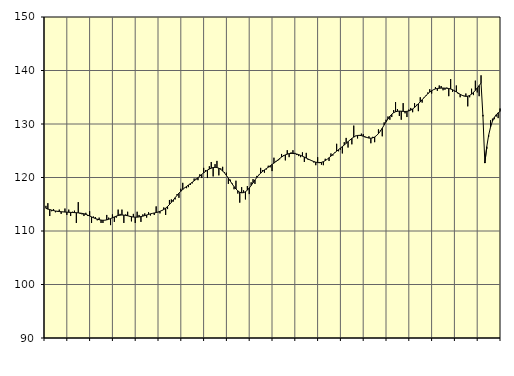
| Category | Piggar | Samtliga anställda (inkl. anställda utomlands) |
|---|---|---|
| nan | 114.7 | 114.23 |
| 1.0 | 115.2 | 114.09 |
| 1.0 | 112.8 | 114.01 |
| 1.0 | 113.7 | 113.9 |
| 1.0 | 114.1 | 113.82 |
| 1.0 | 113.5 | 113.73 |
| 1.0 | 113.6 | 113.69 |
| 1.0 | 114 | 113.64 |
| 1.0 | 113.2 | 113.6 |
| 1.0 | 113.6 | 113.57 |
| 1.0 | 114.2 | 113.54 |
| 1.0 | 113 | 113.52 |
| nan | 114 | 113.5 |
| 2.0 | 112.8 | 113.48 |
| 2.0 | 113.6 | 113.46 |
| 2.0 | 113.8 | 113.44 |
| 2.0 | 111.5 | 113.42 |
| 2.0 | 115.4 | 113.39 |
| 2.0 | 113.2 | 113.35 |
| 2.0 | 113.1 | 113.3 |
| 2.0 | 112.8 | 113.22 |
| 2.0 | 113.4 | 113.11 |
| 2.0 | 112.8 | 112.97 |
| 2.0 | 113.7 | 112.81 |
| nan | 111.5 | 112.64 |
| 3.0 | 112.7 | 112.48 |
| 3.0 | 112.6 | 112.33 |
| 3.0 | 112 | 112.21 |
| 3.0 | 112.5 | 112.11 |
| 3.0 | 111.5 | 112.04 |
| 3.0 | 111.5 | 112 |
| 3.0 | 112 | 112.02 |
| 3.0 | 113 | 112.08 |
| 3.0 | 112.5 | 112.19 |
| 3.0 | 111.1 | 112.32 |
| 3.0 | 113.1 | 112.48 |
| nan | 111.7 | 112.63 |
| 4.0 | 112.5 | 112.78 |
| 4.0 | 114 | 112.89 |
| 4.0 | 113.2 | 112.96 |
| 4.0 | 114 | 112.99 |
| 4.0 | 111.5 | 112.97 |
| 4.0 | 113.1 | 112.92 |
| 4.0 | 113.6 | 112.85 |
| 4.0 | 112.7 | 112.76 |
| 4.0 | 111.8 | 112.67 |
| 4.0 | 113.2 | 112.61 |
| 4.0 | 111.5 | 112.58 |
| nan | 113.6 | 112.59 |
| 5.0 | 113 | 112.63 |
| 5.0 | 111.7 | 112.7 |
| 5.0 | 113.1 | 112.78 |
| 5.0 | 113.3 | 112.88 |
| 5.0 | 112.5 | 112.99 |
| 5.0 | 113.5 | 113.11 |
| 5.0 | 112.9 | 113.2 |
| 5.0 | 113.3 | 113.29 |
| 5.0 | 113 | 113.37 |
| 5.0 | 114.6 | 113.45 |
| 5.0 | 113.5 | 113.55 |
| nan | 113.3 | 113.68 |
| 6.0 | 113.9 | 113.83 |
| 6.0 | 114.4 | 114.02 |
| 6.0 | 113 | 114.27 |
| 6.0 | 114.1 | 114.58 |
| 6.0 | 115.8 | 114.94 |
| 6.0 | 115.9 | 115.35 |
| 6.0 | 115.5 | 115.79 |
| 6.0 | 115.9 | 116.23 |
| 6.0 | 116.9 | 116.66 |
| 6.0 | 116.2 | 117.07 |
| 6.0 | 117.9 | 117.43 |
| nan | 119 | 117.76 |
| 7.0 | 118.1 | 118.05 |
| 7.0 | 118 | 118.33 |
| 7.0 | 118.2 | 118.59 |
| 7.0 | 118.6 | 118.85 |
| 7.0 | 118.9 | 119.11 |
| 7.0 | 119.8 | 119.38 |
| 7.0 | 119.8 | 119.66 |
| 7.0 | 119.5 | 119.96 |
| 7.0 | 120.6 | 120.26 |
| 7.0 | 119.9 | 120.57 |
| 7.0 | 121.8 | 120.87 |
| nan | 121.4 | 121.13 |
| 8.0 | 119.9 | 121.37 |
| 8.0 | 122.1 | 121.58 |
| 8.0 | 122.9 | 121.74 |
| 8.0 | 120.2 | 121.86 |
| 8.0 | 122.5 | 121.9 |
| 8.0 | 123.1 | 121.86 |
| 8.0 | 120.4 | 121.73 |
| 8.0 | 121.7 | 121.52 |
| 8.0 | 122 | 121.22 |
| 8.0 | 121 | 120.84 |
| 8.0 | 120.9 | 120.38 |
| nan | 118.8 | 119.88 |
| 9.0 | 119.6 | 119.34 |
| 9.0 | 118.9 | 118.8 |
| 9.0 | 117.8 | 118.29 |
| 9.0 | 119.4 | 117.85 |
| 9.0 | 117 | 117.5 |
| 9.0 | 115.3 | 117.25 |
| 9.0 | 118.2 | 117.14 |
| 9.0 | 117.6 | 117.17 |
| 9.0 | 115.9 | 117.34 |
| 9.0 | 118.4 | 117.63 |
| 9.0 | 116.9 | 118.03 |
| nan | 119.1 | 118.51 |
| 10.0 | 119.7 | 119.02 |
| 10.0 | 118.8 | 119.54 |
| 10.0 | 120.3 | 120.01 |
| 10.0 | 120.5 | 120.44 |
| 10.0 | 121.8 | 120.81 |
| 10.0 | 121.4 | 121.13 |
| 10.0 | 120.9 | 121.42 |
| 10.0 | 121.5 | 121.67 |
| 10.0 | 122.2 | 121.92 |
| 10.0 | 121.9 | 122.18 |
| 10.0 | 121.2 | 122.44 |
| nan | 123.7 | 122.69 |
| 11.0 | 123.1 | 122.97 |
| 11.0 | 123.1 | 123.26 |
| 11.0 | 123.4 | 123.55 |
| 11.0 | 124.4 | 123.82 |
| 11.0 | 124.2 | 124.05 |
| 11.0 | 123.2 | 124.23 |
| 11.0 | 125.1 | 124.37 |
| 11.0 | 123.8 | 124.46 |
| 11.0 | 124.7 | 124.5 |
| 11.0 | 125.1 | 124.49 |
| 11.0 | 124.6 | 124.46 |
| nan | 124.2 | 124.39 |
| 12.0 | 124 | 124.28 |
| 12.0 | 123.8 | 124.14 |
| 12.0 | 124.7 | 123.98 |
| 12.0 | 122.9 | 123.81 |
| 12.0 | 124.6 | 123.63 |
| 12.0 | 123.3 | 123.45 |
| 12.0 | 123.3 | 123.28 |
| 12.0 | 123.1 | 123.12 |
| 12.0 | 122.8 | 122.98 |
| 12.0 | 122.3 | 122.87 |
| 12.0 | 123.8 | 122.79 |
| nan | 122.9 | 122.77 |
| 13.0 | 122.4 | 122.83 |
| 13.0 | 122.3 | 122.96 |
| 13.0 | 123.5 | 123.16 |
| 13.0 | 123.4 | 123.4 |
| 13.0 | 123.1 | 123.69 |
| 13.0 | 124.5 | 124 |
| 13.0 | 124.1 | 124.31 |
| 13.0 | 124.7 | 124.62 |
| 13.0 | 126.3 | 124.91 |
| 13.0 | 124.9 | 125.21 |
| 13.0 | 125.2 | 125.49 |
| nan | 124.5 | 125.78 |
| 14.0 | 126.6 | 126.07 |
| 14.0 | 127.4 | 126.38 |
| 14.0 | 125.6 | 126.7 |
| 14.0 | 127 | 127.01 |
| 14.0 | 126.2 | 127.3 |
| 14.0 | 129.7 | 127.55 |
| 14.0 | 127.8 | 127.75 |
| 14.0 | 127.3 | 127.86 |
| 14.0 | 127.8 | 127.88 |
| 14.0 | 128.2 | 127.83 |
| 14.0 | 128.1 | 127.72 |
| nan | 127.5 | 127.6 |
| 15.0 | 127.5 | 127.47 |
| 15.0 | 127.7 | 127.37 |
| 15.0 | 126.4 | 127.34 |
| 15.0 | 127.6 | 127.41 |
| 15.0 | 126.6 | 127.57 |
| 15.0 | 127.9 | 127.84 |
| 15.0 | 129 | 128.2 |
| 15.0 | 128.8 | 128.67 |
| 15.0 | 127.7 | 129.22 |
| 15.0 | 130.3 | 129.81 |
| 15.0 | 130.8 | 130.4 |
| nan | 131.4 | 130.95 |
| 16.0 | 130.8 | 131.44 |
| 16.0 | 131.3 | 131.82 |
| 16.0 | 132.6 | 132.11 |
| 16.0 | 134.1 | 132.29 |
| 16.0 | 132.8 | 132.38 |
| 16.0 | 131.5 | 132.41 |
| 16.0 | 130.8 | 132.39 |
| 16.0 | 133.9 | 132.36 |
| 16.0 | 132 | 132.34 |
| 16.0 | 131.3 | 132.37 |
| 16.0 | 132.7 | 132.45 |
| nan | 133 | 132.59 |
| 17.0 | 132.2 | 132.81 |
| 17.0 | 133.9 | 133.09 |
| 17.0 | 133.6 | 133.42 |
| 17.0 | 132.4 | 133.77 |
| 17.0 | 135 | 134.14 |
| 17.0 | 134 | 134.53 |
| 17.0 | 135 | 134.92 |
| 17.0 | 135.4 | 135.3 |
| 17.0 | 135.9 | 135.65 |
| 17.0 | 136.5 | 135.96 |
| 17.0 | 135.7 | 136.22 |
| nan | 136.4 | 136.42 |
| 18.0 | 136.9 | 136.56 |
| 18.0 | 136.2 | 136.64 |
| 18.0 | 137.2 | 136.68 |
| 18.0 | 137.1 | 136.71 |
| 18.0 | 136.3 | 136.72 |
| 18.0 | 136.4 | 136.7 |
| 18.0 | 136.8 | 136.68 |
| 18.0 | 135.2 | 136.63 |
| 18.0 | 138.4 | 136.54 |
| 18.0 | 136 | 136.41 |
| 18.0 | 136.1 | 136.22 |
| nan | 137.2 | 136.01 |
| 19.0 | 135.6 | 135.78 |
| 19.0 | 135 | 135.56 |
| 19.0 | 135.4 | 135.37 |
| 19.0 | 135.3 | 135.22 |
| 19.0 | 135.7 | 135.16 |
| 19.0 | 133.3 | 135.2 |
| 19.0 | 135 | 135.34 |
| 19.0 | 136.6 | 135.58 |
| 19.0 | 135.4 | 135.9 |
| 19.0 | 138.1 | 136.29 |
| 19.0 | 135.9 | 136.73 |
| nan | 135.2 | 137.19 |
| 20.0 | 139.1 | 137.65 |
| 20.0 | 131.7 | 131.42 |
| 20.0 | 122.9 | 122.7 |
| 20.0 | 125.3 | 125.75 |
| 20.0 | 127.6 | 127.91 |
| 20.0 | 130.7 | 129.43 |
| 20.0 | 131 | 130.5 |
| 20.0 | 130.9 | 131.24 |
| 20.0 | 131.4 | 131.74 |
| 20.0 | 131.1 | 132.09 |
| 20.0 | 132.9 | 132.35 |